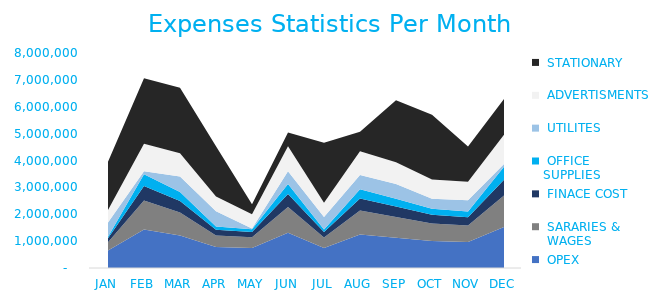
| Category |  OPEX |  SARARIES &
 WAGES |  FINACE COST |  OFFICE 
SUPPLIES |  UTILITES |  ADVERTISMENTS |  STATIONARY |
|---|---|---|---|---|---|---|---|
| JAN | 654000 | 303495 | 151747.5 | 51747.5 | 533100 | 466302 | 1794220 |
| FEB | 1429000 | 1078495 | 539247.5 | 439247.5 | 118500 | 1018877 | 2434560 |
| MAR | 1209000 | 858495 | 429247.5 | 329247.5 | 579000 | 862017 | 2437730 |
| APR | 781000 | 430495 | 215247.5 | 115247.5 | 565500 | 556853 | 1865862 |
| MAY | 747000 | 396495 | 198247.5 | 98247.5 | 28700 | 532611 | 367720 |
| JUN | 1310000 | 959495 | 479747.5 | 379747.5 | 470900 | 934030 | 511004 |
| JUL | 745000 | 394495 | 197247.5 | 97247.5 | 461100 | 531185 | 2231046 |
| AUG | 1243000 | 892495 | 446247.5 | 346247.5 | 534100 | 886259 | 717054 |
| SEP | 1126000 | 775495 | 387747.5 | 287747.5 | 551800 | 802838 | 2312832 |
| OCT | 1003000 | 652495 | 326247.5 | 226247.5 | 370300 | 715139 | 2411102 |
| NOV | 967000 | 616495 | 308247.5 | 208247.5 | 421500 | 689471 | 1311746 |
| DEC | 1524000 | 1173495 | 586747.5 | 486747.5 | 97300 | 1086612 | 1337106 |